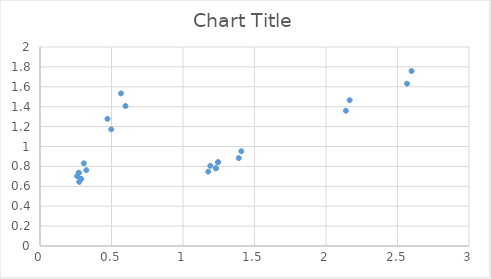
| Category | Series 0 |
|---|---|
| 2.5668353756924827 | 1.631 |
| 2.1390294797437357 | 1.359 |
| 1.3903691618334282 | 0.884 |
| 1.229941950852648 | 0.782 |
| 1.229941950852648 | 0.782 |
| 1.1764662138590547 | 0.748 |
| 2.5985846847876926 | 1.758 |
| 2.1654872373230774 | 1.465 |
| 1.4075667042600002 | 0.952 |
| 1.2451551614607692 | 0.842 |
| 1.2451551614607692 | 0.842 |
| 1.1910179805276924 | 0.806 |
| 0.5662504800474719 | 1.534 |
| 0.47187540003955986 | 1.278 |
| 0.3067190100257139 | 0.831 |
| 0.2713283550227469 | 0.735 |
| 0.2713283550227469 | 0.735 |
| 0.2595314700217579 | 0.703 |
| 0.5979997891426815 | 1.407 |
| 0.49833315761890123 | 1.172 |
| 0.3239165524522858 | 0.762 |
| 0.28654156563086813 | 0.674 |
| 0.28654156563086813 | 0.674 |
| 0.27408323669039564 | 0.645 |